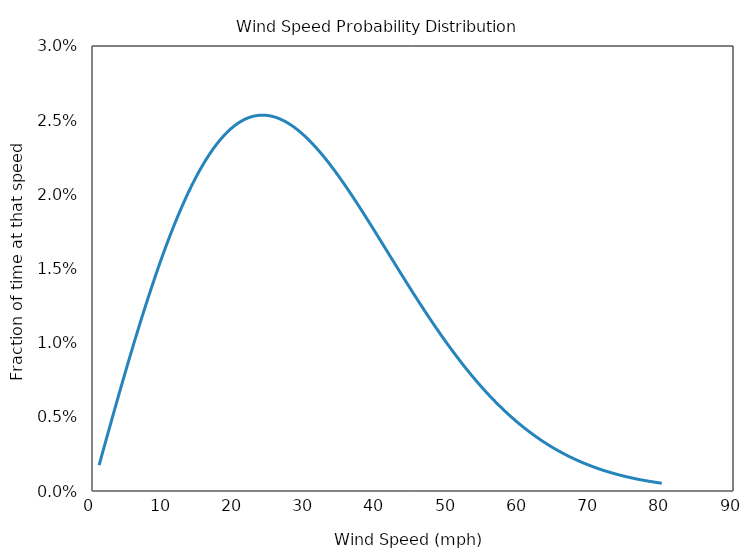
| Category | Series 0 |
|---|---|
| 1.0 | 0.002 |
| 2.0 | 0.003 |
| 3.0 | 0.005 |
| 4.0 | 0.007 |
| 5.0 | 0.009 |
| 6.0 | 0.01 |
| 7.0 | 0.012 |
| 8.0 | 0.013 |
| 9.0 | 0.015 |
| 10.0 | 0.016 |
| 11.0 | 0.017 |
| 12.0 | 0.018 |
| 13.0 | 0.02 |
| 14.0 | 0.021 |
| 15.0 | 0.022 |
| 16.0 | 0.022 |
| 17.0 | 0.023 |
| 18.0 | 0.024 |
| 19.0 | 0.024 |
| 20.0 | 0.025 |
| 21.0 | 0.025 |
| 22.0 | 0.025 |
| 23.0 | 0.025 |
| 24.0 | 0.025 |
| 25.0 | 0.025 |
| 26.0 | 0.025 |
| 27.0 | 0.025 |
| 28.0 | 0.025 |
| 29.0 | 0.024 |
| 30.0 | 0.024 |
| 31.0 | 0.023 |
| 32.0 | 0.023 |
| 33.0 | 0.022 |
| 34.0 | 0.022 |
| 35.0 | 0.021 |
| 36.0 | 0.02 |
| 37.0 | 0.02 |
| 38.0 | 0.019 |
| 39.0 | 0.018 |
| 40.0 | 0.017 |
| 41.0 | 0.017 |
| 42.0 | 0.016 |
| 43.0 | 0.015 |
| 44.0 | 0.014 |
| 45.0 | 0.013 |
| 46.0 | 0.013 |
| 47.0 | 0.012 |
| 48.0 | 0.011 |
| 49.0 | 0.011 |
| 50.0 | 0.01 |
| 51.0 | 0.009 |
| 52.0 | 0.009 |
| 53.0 | 0.008 |
| 54.0 | 0.007 |
| 55.0 | 0.007 |
| 56.0 | 0.006 |
| 57.0 | 0.006 |
| 58.0 | 0.005 |
| 59.0 | 0.005 |
| 60.0 | 0.005 |
| 61.0 | 0.004 |
| 62.0 | 0.004 |
| 63.0 | 0.003 |
| 64.0 | 0.003 |
| 65.0 | 0.003 |
| 66.0 | 0.003 |
| 67.0 | 0.002 |
| 68.0 | 0.002 |
| 69.0 | 0.002 |
| 70.0 | 0.002 |
| 71.0 | 0.002 |
| 72.0 | 0.001 |
| 73.0 | 0.001 |
| 74.0 | 0.001 |
| 75.0 | 0.001 |
| 76.0 | 0.001 |
| 77.0 | 0.001 |
| 78.0 | 0.001 |
| 79.0 | 0.001 |
| 80.0 | 0.001 |